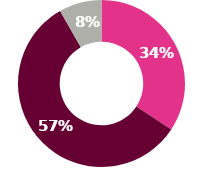
| Category | Series 0 |
|---|---|
| 0 | 35.3 |
| 1 | 59.2 |
| 2 | 8.5 |